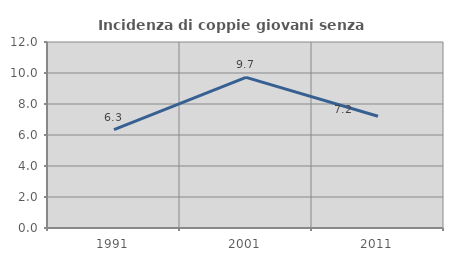
| Category | Incidenza di coppie giovani senza figli |
|---|---|
| 1991.0 | 6.346 |
| 2001.0 | 9.716 |
| 2011.0 | 7.207 |